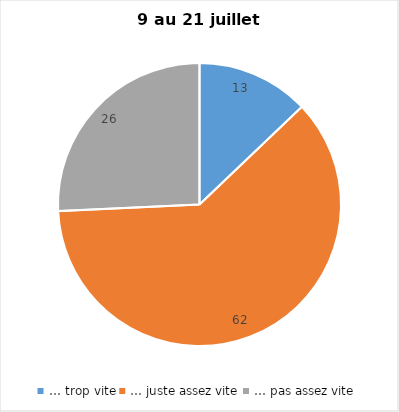
| Category | Series 0 |
|---|---|
| … trop vite | 13 |
| … juste assez vite | 62 |
| … pas assez vite | 26 |